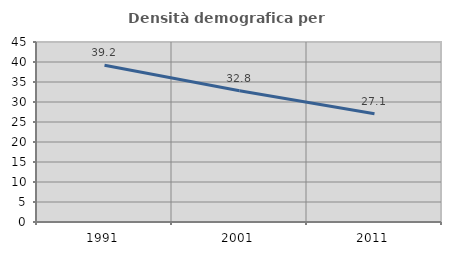
| Category | Densità demografica |
|---|---|
| 1991.0 | 39.174 |
| 2001.0 | 32.821 |
| 2011.0 | 27.074 |